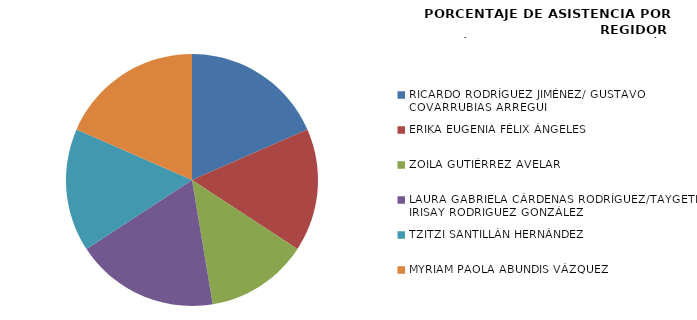
| Category | Series 0 |
|---|---|
| RICARDO RODRÍGUEZ JIMÉNEZ/ GUSTAVO COVARRUBIAS ARREGUI | 100 |
| ERIKA EUGENIA FÉLIX ÁNGELES | 85.714 |
| ZOILA GUTIÉRREZ AVELAR | 71.429 |
| LAURA GABRIELA CÁRDENAS RODRÍGUEZ/TAYGETE IRISAY RODRIGUEZ GONZÁLEZ | 100 |
| TZITZI SANTILLÁN HERNÁNDEZ | 85.714 |
| MYRIAM PAOLA ABUNDIS VÁZQUEZ | 100 |